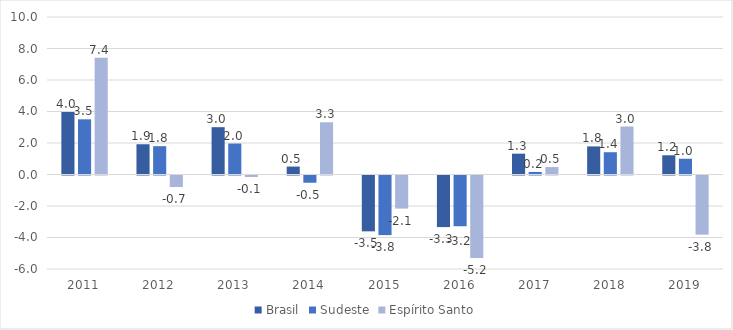
| Category | Brasil | Sudeste | Espírito Santo |
|---|---|---|---|
| 2011.0 | 3.974 | 3.504 | 7.407 |
| 2012.0 | 1.921 | 1.798 | -0.73 |
| 2013.0 | 3.005 | 1.965 | -0.096 |
| 2014.0 | 0.504 | -0.46 | 3.314 |
| 2015.0 | -3.546 | -3.784 | -2.1 |
| 2016.0 | -3.276 | -3.221 | -5.237 |
| 2017.0 | 1.323 | 0.163 | 0.471 |
| 2018.0 | 1.784 | 1.415 | 3.047 |
| 2019.0 | 1.221 | 1.001 | -3.756 |